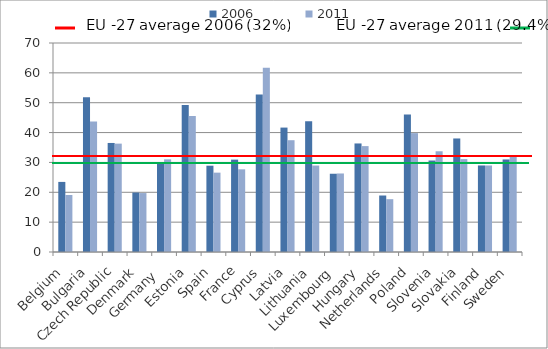
| Category | 2006 | 2011 |
|---|---|---|
| Belgium | 23.475 | 19.098 |
| Bulgaria | 51.817 | 43.743 |
| Czech Republic | 36.52 | 36.298 |
| Denmark | 19.909 | 19.74 |
| Germany  | 29.584 | 31.032 |
| Estonia | 49.273 | 45.586 |
| Spain | 28.9 | 26.579 |
| France | 30.94 | 27.689 |
| Cyprus | 52.727 | 61.721 |
| Latvia | 41.671 | 37.443 |
| Lithuania | 43.803 | 28.953 |
| Luxembourg | 26.211 | 26.3 |
| Hungary | 36.355 | 35.466 |
| Netherlands | 18.921 | 17.691 |
| Poland | 46.018 | 39.819 |
| Slovenia | 30.637 | 33.739 |
| Slovakia | 38.025 | 31.105 |
| Finland | 28.982 | 28.968 |
| Sweden | 30.999 | 32.45 |